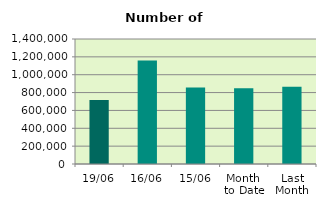
| Category | Series 0 |
|---|---|
| 19/06 | 717440 |
| 16/06 | 1159964 |
| 15/06 | 857494 |
| Month 
to Date | 847838.154 |
| Last
Month | 864947.182 |